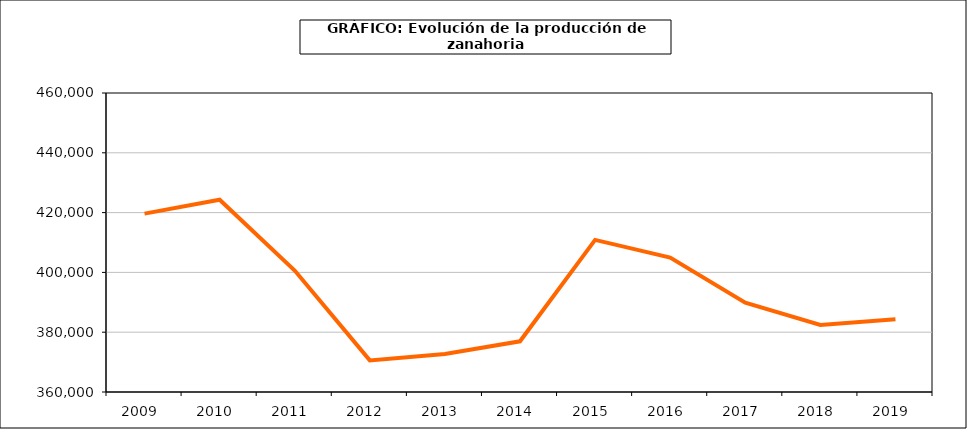
| Category | producción |
|---|---|
| 2009.0 | 419662 |
| 2010.0 | 424311 |
| 2011.0 | 400628 |
| 2012.0 | 370570 |
| 2013.0 | 372714 |
| 2014.0 | 376952 |
| 2015.0 | 410865 |
| 2016.0 | 404962 |
| 2017.0 | 389844 |
| 2018.0 | 382427 |
| 2019.0 | 384295 |